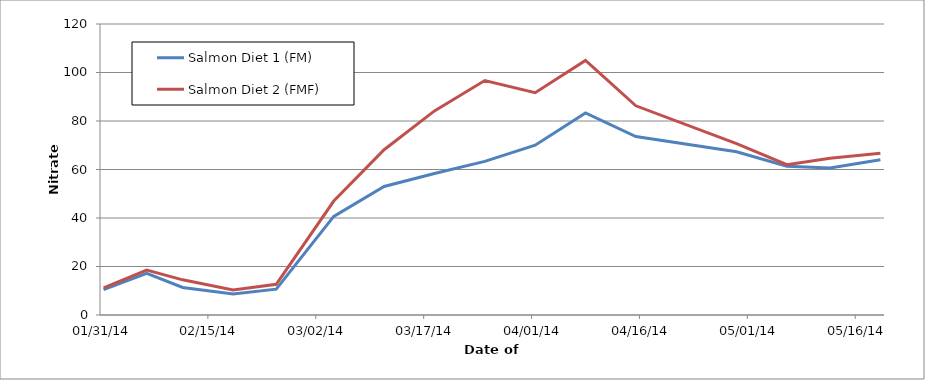
| Category | Salmon Diet 1 (FM) | Salmon Diet 2 (FMF) |
|---|---|---|
| 2014-01-31 | 10.5 | 11.167 |
| 2014-02-06 | 17.167 | 18.5 |
| 2014-02-11 | 11.333 | 14.5 |
| 2014-02-18 | 8.667 | 10.333 |
| 2014-02-24 | 10.667 | 12.667 |
| 2014-03-04 | 40.667 | 47 |
| 2014-03-11 | 53 | 68.167 |
| 2014-03-18 | 58.333 | 84.167 |
| 2014-03-25 | 63.333 | 96.667 |
| 2014-04-01 | 70 | 91.667 |
| 2014-04-08 | 83.333 | 105 |
| 2014-04-15 | 73.6 | 86.267 |
| 2014-04-29 | 67.333 | 70.667 |
| 2014-05-06 | 61.333 | 62 |
| 2014-05-12 | 60.667 | 64.667 |
| 2014-05-19 | 64 | 66.667 |